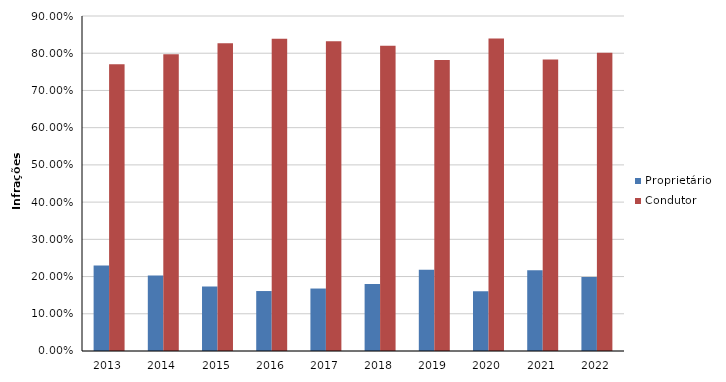
| Category | Proprietário | Condutor |
|---|---|---|
| 2013 | 0.229 | 0.771 |
| 2014 | 0.203 | 0.797 |
| 2015 | 0.173 | 0.827 |
| 2016 | 0.161 | 0.839 |
| 2017 | 0.168 | 0.832 |
| 2018 | 0.18 | 0.82 |
| 2019 | 0.218 | 0.782 |
| 2020 | 0.161 | 0.839 |
| 2021 | 0.217 | 0.783 |
| 2022 | 0.199 | 0.801 |